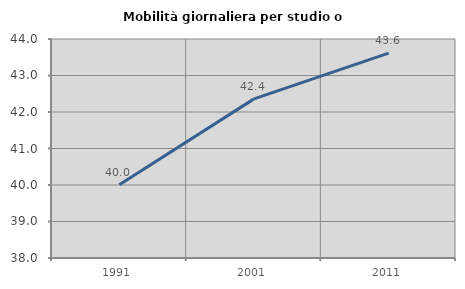
| Category | Mobilità giornaliera per studio o lavoro |
|---|---|
| 1991.0 | 40.007 |
| 2001.0 | 42.359 |
| 2011.0 | 43.612 |